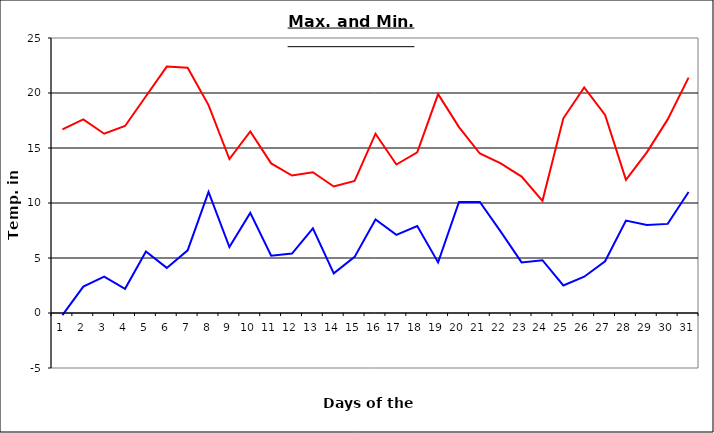
| Category | Series 0 | Series 1 |
|---|---|---|
| 0 | 16.7 | -0.2 |
| 1 | 17.6 | 2.4 |
| 2 | 16.3 | 3.3 |
| 3 | 17 | 2.2 |
| 4 | 19.7 | 5.6 |
| 5 | 22.4 | 4.1 |
| 6 | 22.3 | 5.7 |
| 7 | 18.9 | 11 |
| 8 | 14 | 6 |
| 9 | 16.5 | 9.1 |
| 10 | 13.6 | 5.2 |
| 11 | 12.5 | 5.4 |
| 12 | 12.8 | 7.7 |
| 13 | 11.5 | 3.6 |
| 14 | 12 | 5.1 |
| 15 | 16.3 | 8.5 |
| 16 | 13.5 | 7.1 |
| 17 | 14.6 | 7.9 |
| 18 | 19.9 | 4.6 |
| 19 | 16.9 | 10.1 |
| 20 | 14.5 | 10.1 |
| 21 | 13.6 | 7.4 |
| 22 | 12.4 | 4.6 |
| 23 | 10.2 | 4.8 |
| 24 | 17.7 | 2.5 |
| 25 | 20.5 | 3.3 |
| 26 | 18 | 4.7 |
| 27 | 12.1 | 8.4 |
| 28 | 14.6 | 8 |
| 29 | 17.6 | 8.1 |
| 30 | 21.4 | 11 |